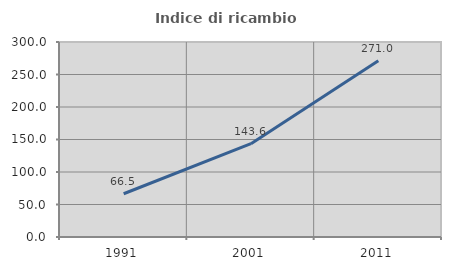
| Category | Indice di ricambio occupazionale  |
|---|---|
| 1991.0 | 66.512 |
| 2001.0 | 143.624 |
| 2011.0 | 271.014 |